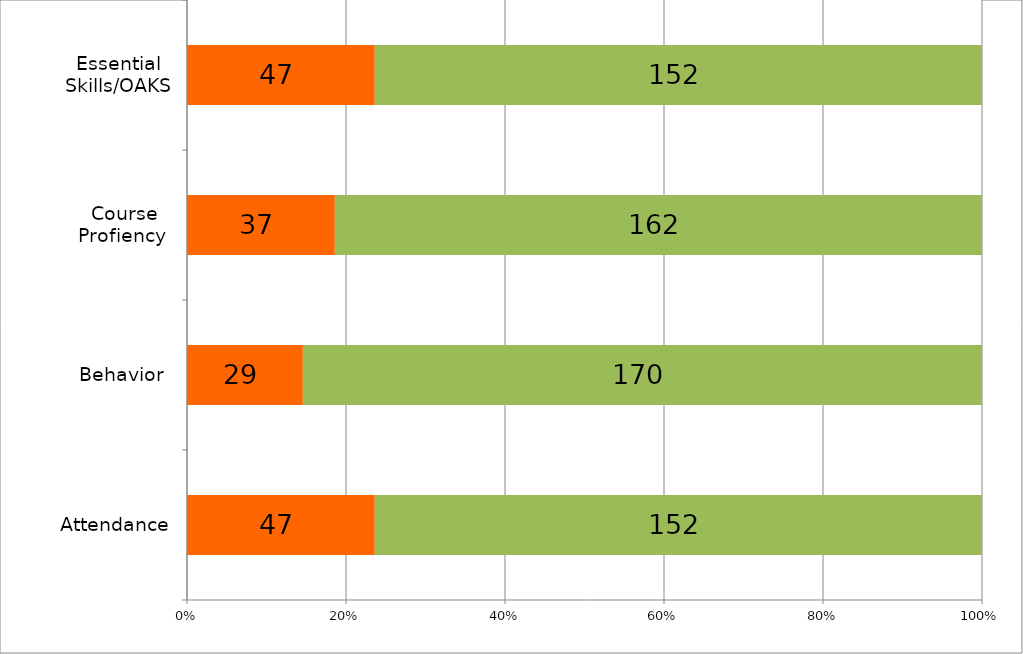
| Category | Series 0 | Series 1 |
|---|---|---|
| Attendance | 47 | 152 |
| Behavior  | 29 | 170 |
| Course Profiency  | 37 | 162 |
| Essential Skills/OAKS | 47 | 152 |